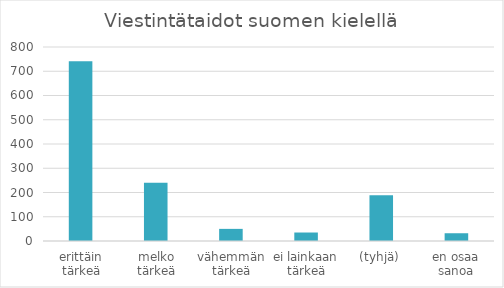
| Category | Summa |
|---|---|
| erittäin tärkeä | 741 |
| melko tärkeä | 240 |
| vähemmän tärkeä | 50 |
| ei lainkaan tärkeä | 35 |
| (tyhjä) | 189 |
| en osaa sanoa | 32 |